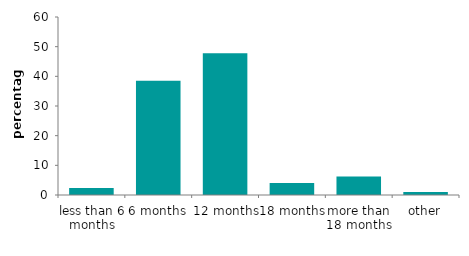
| Category | Series 0 |
|---|---|
| less than 6 months | 2.387 |
| 6 months | 38.533 |
| 12 months | 47.81 |
| 18 months | 4.038 |
| more than 18 months | 6.211 |
| other | 1.021 |